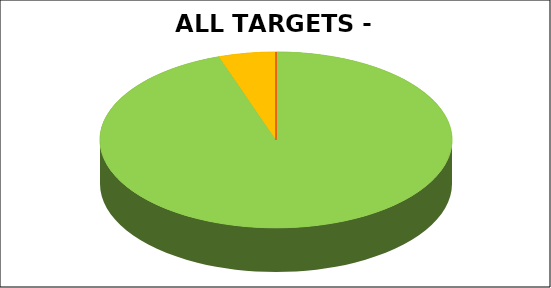
| Category | Series 0 |
|---|---|
| Green | 0.947 |
| Amber | 0.053 |
| Red | 0 |